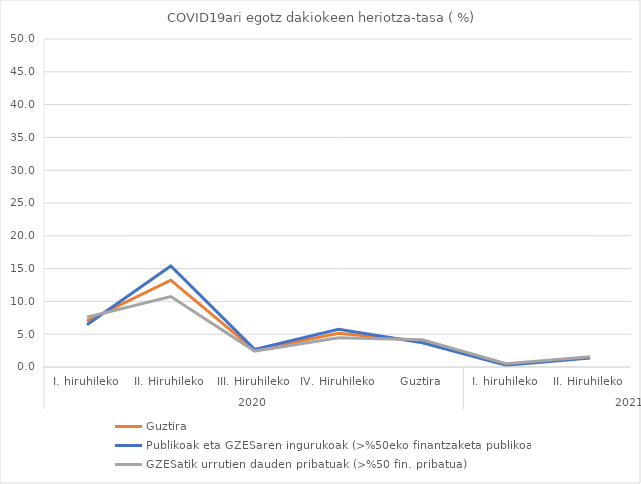
| Category | Guztira | Publikoak eta GZESaren ingurukoak (>%50eko finantzaketa publikoa) | GZESatik urrutien dauden pribatuak (>%50 fin. pribatua) |
|---|---|---|---|
| 0 | 6.979 | 6.446 | 7.592 |
| 1 | 13.228 | 15.39 | 10.746 |
| 2 | 2.57 | 2.692 | 2.431 |
| 3 | 5.144 | 5.747 | 4.451 |
| 4 | 3.914 | 3.7 | 4.156 |
| 5 | 0.385 | 0.288 | 0.499 |
| 6 | 1.463 | 1.369 | 1.571 |